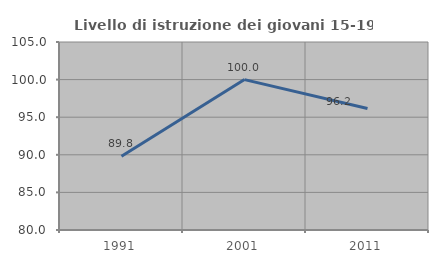
| Category | Livello di istruzione dei giovani 15-19 anni |
|---|---|
| 1991.0 | 89.796 |
| 2001.0 | 100 |
| 2011.0 | 96.154 |